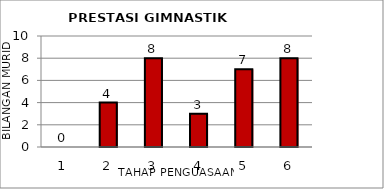
| Category | Series 0 |
|---|---|
| 1.0 | 0 |
| 2.0 | 4 |
| 3.0 | 8 |
| 4.0 | 3 |
| 5.0 | 7 |
| 6.0 | 8 |